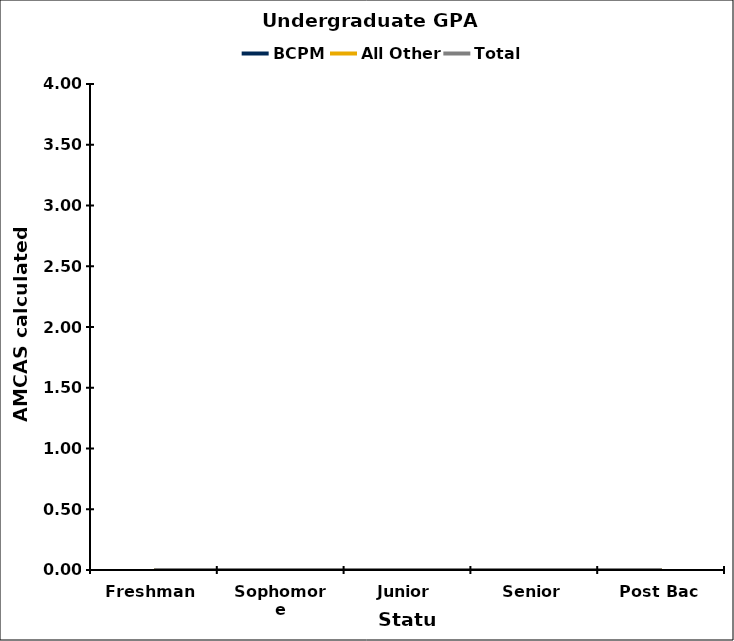
| Category | BCPM | All Other | Total |
|---|---|---|---|
| Freshman | 0 | 0 | 0 |
| Sophomore | 0 | 0 | 0 |
| Junior | 0 | 0 | 0 |
| Senior | 0 | 0 | 0 |
| Post Bac | 0 | 0 | 0 |